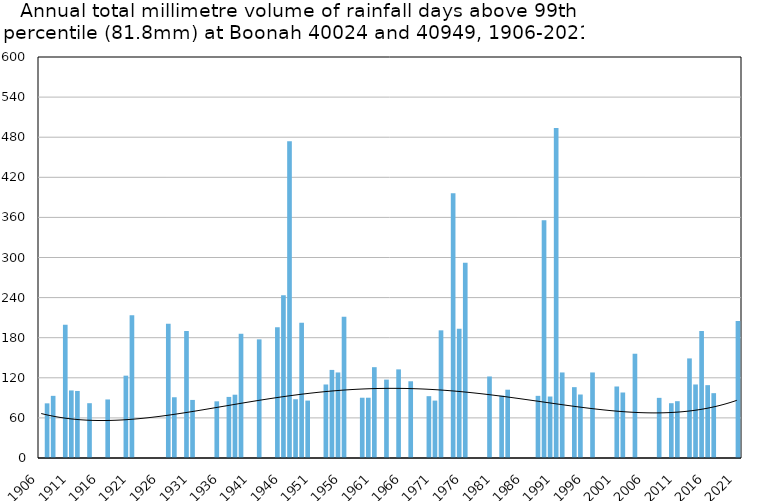
| Category | Annual total mm in days above 99th percentile |
|---|---|
| 1906 | 0 |
| 1907 | 81.8 |
| 1908 | 93 |
| 1909 | 0 |
| 1910 | 199.4 |
| 1911 | 101.1 |
| 1912 | 100.3 |
| 1913 | 0 |
| 1914 | 82 |
| 1915 | 0 |
| 1916 | 0 |
| 1917 | 87.6 |
| 1918 | 0 |
| 1919 | 0 |
| 1920 | 123.2 |
| 1921 | 213.6 |
| 1922 | 0 |
| 1923 | 0 |
| 1924 | 0 |
| 1925 | 0 |
| 1926 | 0 |
| 1927 | 200.7 |
| 1928 | 90.9 |
| 1929 | 0 |
| 1930 | 190 |
| 1931 | 86.9 |
| 1932 | 0 |
| 1933 | 0 |
| 1934 | 0 |
| 1935 | 84.8 |
| 1936 | 0 |
| 1937 | 91.4 |
| 1938 | 94.7 |
| 1939 | 185.9 |
| 1940 | 0 |
| 1941 | 0 |
| 1942 | 177.5 |
| 1943 | 0 |
| 1944 | 0 |
| 1945 | 195.6 |
| 1946 | 243.4 |
| 1947 | 473.8 |
| 1948 | 87.9 |
| 1949 | 202.4 |
| 1950 | 85.9 |
| 1951 | 0 |
| 1952 | 0 |
| 1953 | 110 |
| 1954 | 131.8 |
| 1955 | 128 |
| 1956 | 211.3 |
| 1957 | 0 |
| 1958 | 0 |
| 1959 | 90.2 |
| 1960 | 90.2 |
| 1961 | 135.9 |
| 1962 | 0 |
| 1963 | 117.3 |
| 1964 | 0 |
| 1965 | 132.6 |
| 1966 | 0 |
| 1967 | 114.8 |
| 1968 | 0 |
| 1969 | 0 |
| 1970 | 92.5 |
| 1971 | 85.9 |
| 1972 | 191 |
| 1973 | 0 |
| 1974 | 396 |
| 1975 | 193.4 |
| 1976 | 292.2 |
| 1977 | 0 |
| 1978 | 0 |
| 1979 | 0 |
| 1980 | 122 |
| 1981 | 0 |
| 1982 | 93.4 |
| 1983 | 102.2 |
| 1984 | 0 |
| 1985 | 0 |
| 1986 | 0 |
| 1987 | 0 |
| 1988 | 93 |
| 1989 | 355.6 |
| 1990 | 92 |
| 1991 | 493.6 |
| 1992 | 128 |
| 1993 | 0 |
| 1994 | 106 |
| 1995 | 95 |
| 1996 | 0 |
| 1997 | 128 |
| 1998 | 0 |
| 1999 | 0 |
| 2000 | 0 |
| 2001 | 107 |
| 2002 | 98 |
| 2003 | 0 |
| 2004 | 156 |
| 2005 | 0 |
| 2006 | 0 |
| 2007 | 0 |
| 2008 | 90 |
| 2009 | 0 |
| 2010 | 82 |
| 2011 | 85 |
| 2012 | 0 |
| 2013 | 149 |
| 2014 | 110 |
| 2015 | 190 |
| 2016 | 109 |
| 2017 | 97 |
| 2018 | 0 |
| 2019 | 0 |
| 2020 | 0 |
| 2021 | 205 |